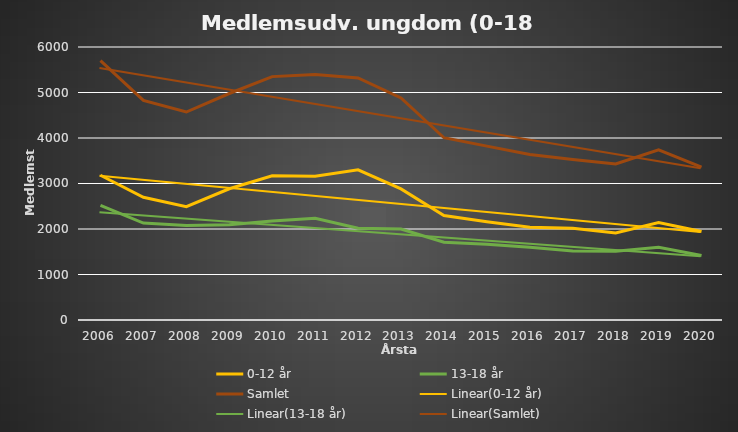
| Category | 0-12 år | 13-18 år | Samlet |
|---|---|---|---|
| 2006.0 | 3182 | 2520 | 5702 |
| 2007.0 | 2697 | 2131 | 4828 |
| 2008.0 | 2492 | 2079 | 4571 |
| 2009.0 | 2884 | 2094 | 4978 |
| 2010.0 | 3171 | 2178 | 5349 |
| 2011.0 | 3161 | 2235 | 5396 |
| 2012.0 | 3302 | 2017 | 5319 |
| 2013.0 | 2882 | 1999 | 4881 |
| 2014.0 | 2296 | 1710 | 4006 |
| 2015.0 | 2159 | 1663 | 3822 |
| 2016.0 | 2037 | 1599 | 3636 |
| 2017.0 | 2014 | 1514 | 3528 |
| 2018.0 | 1915 | 1513 | 3428 |
| 2019.0 | 2141 | 1598 | 3739 |
| 2020.0 | 1944 | 1416 | 3360 |